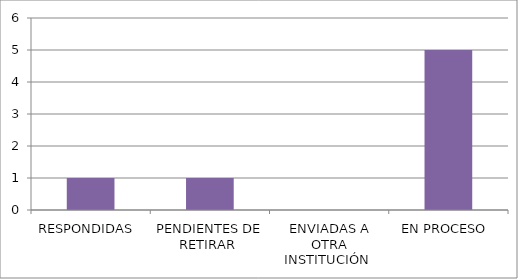
| Category | Series 0 |
|---|---|
| RESPONDIDAS  | 1 |
| PENDIENTES DE RETIRAR  | 1 |
| ENVIADAS A OTRA INSTITUCIÓN  | 0 |
| EN PROCESO  | 5 |